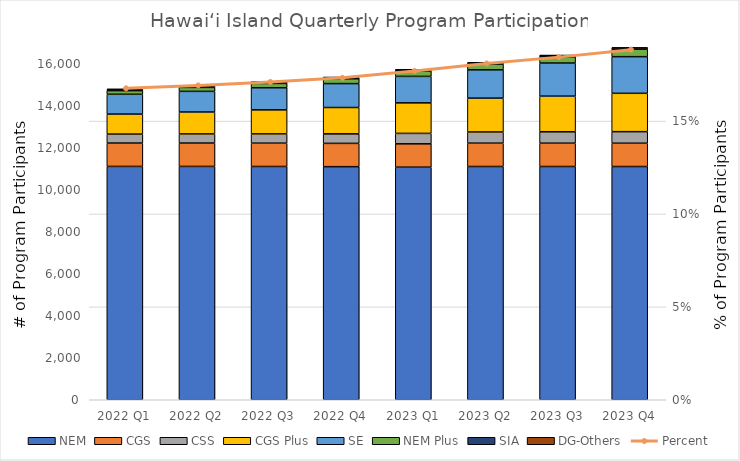
| Category | NEM | CGS | CSS | CGS Plus | SE | NEM Plus | SIA | DG-Others |
|---|---|---|---|---|---|---|---|---|
| 2022 Q1 | 11105 | 1112 | 426 | 952 | 943 | 174 | 55 | 21 |
| 2022 Q2 | 11105 | 1112 | 433 | 1045 | 982 | 188 | 56 | 21 |
| 2022 Q3 | 11103 | 1109 | 440 | 1145 | 1053 | 205 | 57 | 21 |
| 2022 Q4 | 11093 | 1109 | 453 | 1254 | 1137 | 230 | 57 | 21 |
| 2023 Q1 | 11069 | 1111 | 496 | 1454 | 1260 | 254 | 57 | 21 |
| 2023 Q2 | 11101 | 1111 | 531 | 1613 | 1347 | 272 | 57 | 21 |
| 2023 Q3 | 11101 | 1110 | 542 | 1697 | 1575 | 296 | 58 | 21 |
| 2023 Q4 | 11100 | 1109 | 550 | 1825 | 1744 | 353 | 59 | 21 |